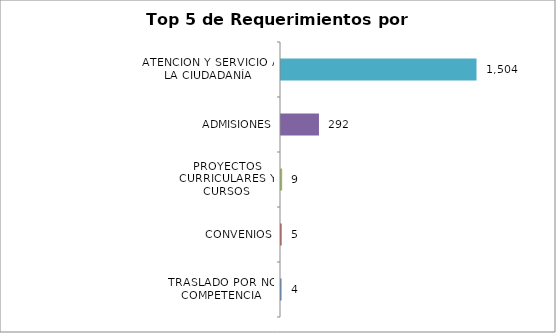
| Category | Total |
|---|---|
| TRASLADO POR NO COMPETENCIA | 4 |
| CONVENIOS | 5 |
| PROYECTOS CURRICULARES Y CURSOS | 9 |
| ADMISIONES | 292 |
| ATENCIÓN Y SERVICIO A LA CIUDADANÍA | 1504 |